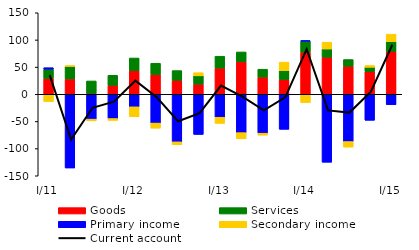
| Category | Goods | Services | Primary income | Secondary income |
|---|---|---|---|---|
| I/11 | 28.994 | 17.24 | 2.716 | -13.37 |
| II | 28.218 | 22.874 | -135.675 | 1.741 |
| III | 1.774 | 22.739 | -45.729 | -3.187 |
| IV | 16.492 | 18.43 | -44.657 | -3.399 |
| I/12 | 43.281 | 23.478 | -23.083 | -18.258 |
| II | 36.152 | 20.972 | -52.981 | -9.36 |
| III | 25.681 | 17.923 | -87.565 | -5.364 |
| IV | 18.683 | 15.252 | -73.899 | 5.772 |
| I/13 | 48.355 | 21.702 | -42.281 | -11.28 |
| II | 59.692 | 18.186 | -70.624 | -11.218 |
| III | 31.672 | 14.458 | -71.638 | -3.56 |
| IV | 27.254 | 16.013 | -64.475 | 15.96 |
| I/14 | 77.394 | 20.418 | 1.008 | -15.254 |
| II | 68.219 | 15.152 | -125.09 | 12.495 |
| III | 51.694 | 12.235 | -87.004 | -10.21 |
| IV | 41.587 | 8.072 | -47.876 | 3.26 |
| I/15 | 78.922 | 17.809 | -19.105 | 13.923 |